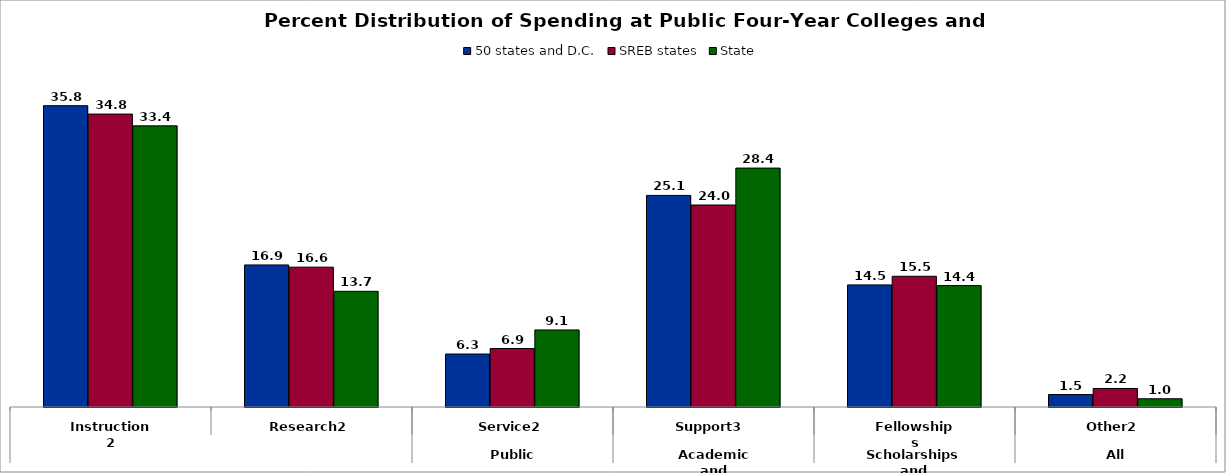
| Category | 50 states and D.C. | SREB states | State |
|---|---|---|---|
| 0 | 35.766 | 34.769 | 33.371 |
| 1 | 16.862 | 16.6 | 13.731 |
| 2 | 6.287 | 6.939 | 9.147 |
| 3 | 25.114 | 23.976 | 28.357 |
| 4 | 14.491 | 15.516 | 14.416 |
| 5 | 1.481 | 2.199 | 0.979 |